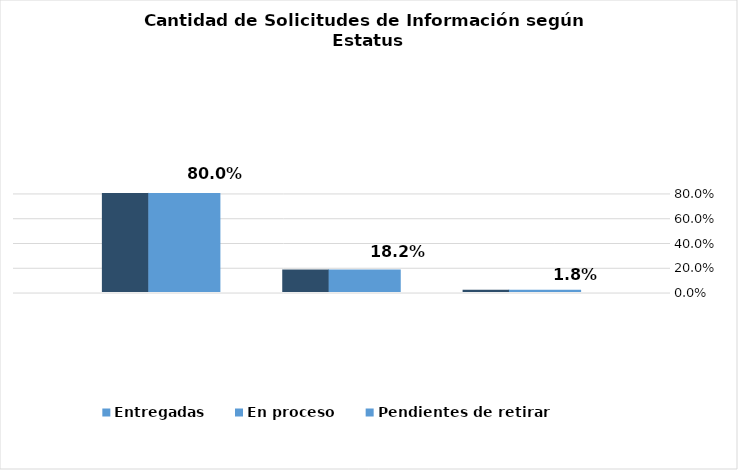
| Category | Entregadas | En proceso | Pendientes de retirar |
|---|---|---|---|
|  | 0.8 | 0.182 | 0.018 |